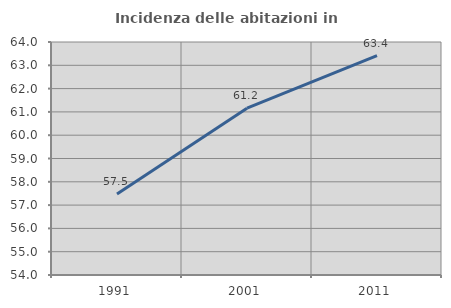
| Category | Incidenza delle abitazioni in proprietà  |
|---|---|
| 1991.0 | 57.478 |
| 2001.0 | 61.159 |
| 2011.0 | 63.414 |